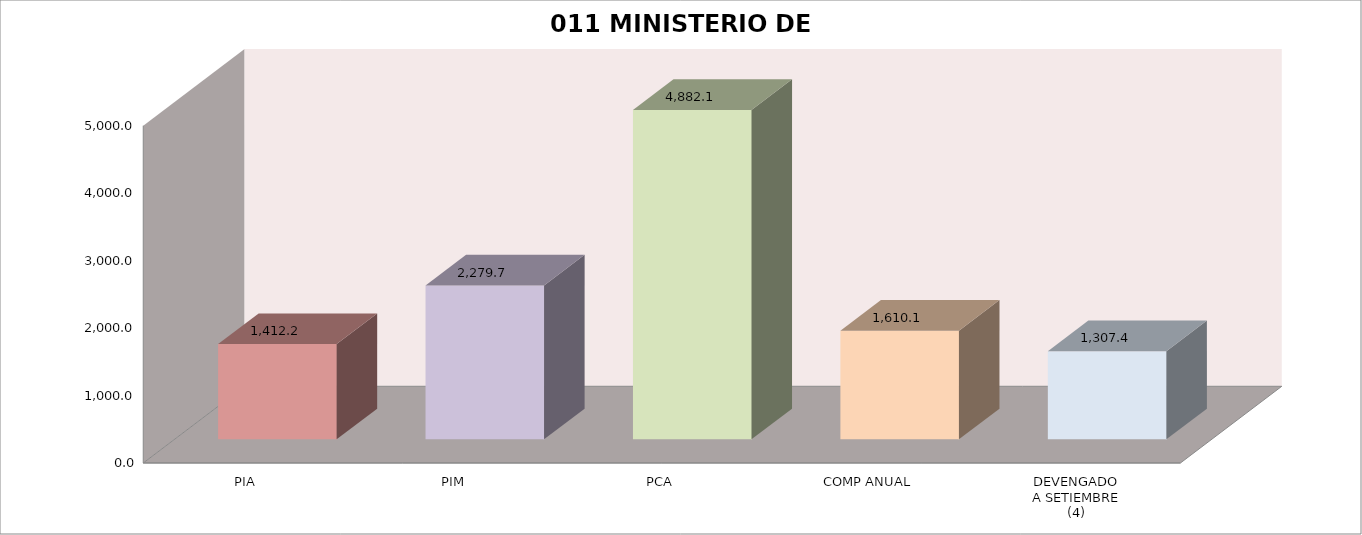
| Category | 011 MINISTERIO DE SALUD |
|---|---|
| PIA | 1412.218 |
| PIM | 2279.664 |
| PCA | 4882.137 |
| COMP ANUAL | 1610.141 |
| DEVENGADO
A SETIEMBRE
(4) | 1307.384 |